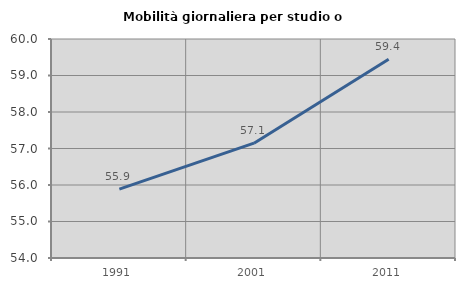
| Category | Mobilità giornaliera per studio o lavoro |
|---|---|
| 1991.0 | 55.887 |
| 2001.0 | 57.146 |
| 2011.0 | 59.448 |